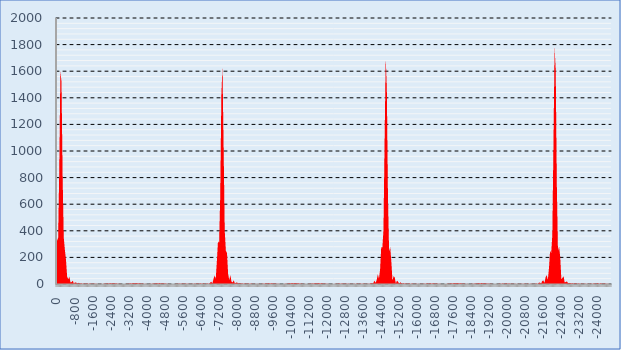
| Category | Series 0 |
|---|---|
| 0.0 | 324.139 |
| -50.0 | 347.293 |
| -100.0 | 855.829 |
| -150.0 | 1596.066 |
| -200.0 | 1522.161 |
| -250.0 | 809.824 |
| -300.0 | 350.562 |
| -350.0 | 256.687 |
| -400.0 | 180.606 |
| -450.0 | 55.817 |
| -500.0 | 36.286 |
| -550.0 | 54.382 |
| -600.0 | 11.873 |
| -650.0 | 14.307 |
| -700.0 | 25.778 |
| -750.0 | 1.802 |
| -800.0 | 12.129 |
| -850.0 | 11.323 |
| -900.0 | 0.626 |
| -950.0 | 9.683 |
| -1000.0 | 2.788 |
| -1050.0 | 2.96 |
| -1100.0 | 5.514 |
| -1150.0 | 0.254 |
| -1200.0 | 5.251 |
| -1250.0 | 1.764 |
| -1300.0 | 1.948 |
| -1350.0 | 5.346 |
| -1400.0 | 0.113 |
| -1450.0 | 4.185 |
| -1500.0 | 3.317 |
| -1550.0 | 0.353 |
| -1600.0 | 4.18 |
| -1650.0 | 0.961 |
| -1700.0 | 1.043 |
| -1750.0 | 2.065 |
| -1800.0 | 0.179 |
| -1850.0 | 1.098 |
| -1900.0 | 0.273 |
| -1950.0 | 1.487 |
| -2000.0 | 0.707 |
| -2050.0 | 0.991 |
| -2100.0 | 3.765 |
| -2150.0 | 0.818 |
| -2200.0 | 4.047 |
| -2250.0 | 5.254 |
| -2300.0 | 1.878 |
| -2350.0 | 7.042 |
| -2400.0 | 4.913 |
| -2450.0 | 3.163 |
| -2500.0 | 7.515 |
| -2550.0 | 3.068 |
| -2600.0 | 3.424 |
| -2650.0 | 5.14 |
| -2700.0 | 1.019 |
| -2750.0 | 2.218 |
| -2800.0 | 2.033 |
| -2850.0 | 0.037 |
| -2900.0 | 0.582 |
| -2950.0 | 0.924 |
| -3000.0 | 0.56 |
| -3050.0 | 0.274 |
| -3100.0 | 2.831 |
| -3150.0 | 2.06 |
| -3200.0 | 2.167 |
| -3250.0 | 6.222 |
| -3300.0 | 3.516 |
| -3350.0 | 5.265 |
| -3400.0 | 8.338 |
| -3450.0 | 4.064 |
| -3500.0 | 7.344 |
| -3550.0 | 7.481 |
| -3600.0 | 3.431 |
| -3650.0 | 6.783 |
| -3700.0 | 4.341 |
| -3750.0 | 2.003 |
| -3800.0 | 4.023 |
| -3850.0 | 1.309 |
| -3900.0 | 0.588 |
| -3950.0 | 1.332 |
| -4000.0 | 0.465 |
| -4050.0 | 0 |
| -4100.0 | 0.97 |
| -4150.0 | 1.973 |
| -4200.0 | 0.624 |
| -4250.0 | 3.295 |
| -4300.0 | 4.155 |
| -4350.0 | 2.153 |
| -4400.0 | 6.422 |
| -4450.0 | 5.033 |
| -4500.0 | 3.691 |
| -4550.0 | 7.774 |
| -4600.0 | 3.932 |
| -4650.0 | 4.257 |
| -4700.0 | 6.218 |
| -4750.0 | 1.839 |
| -4800.0 | 3.44 |
| -4850.0 | 2.98 |
| -4900.0 | 0.34 |
| -4950.0 | 1.744 |
| -5000.0 | 0.554 |
| -5050.0 | 0.218 |
| -5100.0 | 0.304 |
| -5150.0 | 0.579 |
| -5200.0 | 0.936 |
| -5250.0 | 0.109 |
| -5300.0 | 2.496 |
| -5350.0 | 1.377 |
| -5400.0 | 1.258 |
| -5450.0 | 4.169 |
| -5500.0 | 1.041 |
| -5550.0 | 2.869 |
| -5600.0 | 3.866 |
| -5650.0 | 0.534 |
| -5700.0 | 3.738 |
| -5750.0 | 1.858 |
| -5800.0 | 0.907 |
| -5850.0 | 3.26 |
| -5900.0 | 0.167 |
| -5950.0 | 2.472 |
| -6000.0 | 1.874 |
| -6050.0 | 0.658 |
| -6100.0 | 4.272 |
| -6150.0 | 0.639 |
| -6200.0 | 3.181 |
| -6250.0 | 4.829 |
| -6300.0 | 0.276 |
| -6350.0 | 5.544 |
| -6400.0 | 3.662 |
| -6450.0 | 0.524 |
| -6500.0 | 5.665 |
| -6550.0 | 2.391 |
| -6600.0 | 0.478 |
| -6650.0 | 4.549 |
| -6700.0 | 4.761 |
| -6750.0 | 0.067 |
| -6800.0 | 8.823 |
| -6850.0 | 17.345 |
| -6900.0 | 3.51 |
| -6950.0 | 37.293 |
| -7000.0 | 64.078 |
| -7050.0 | 38.153 |
| -7100.0 | 170.449 |
| -7150.0 | 321.155 |
| -7200.0 | 309.163 |
| -7250.0 | 663.767 |
| -7300.0 | 1421.388 |
| -7350.0 | 1639.619 |
| -7400.0 | 1035.175 |
| -7450.0 | 400.012 |
| -7500.0 | 251.017 |
| -7550.0 | 233.386 |
| -7600.0 | 77.409 |
| -7650.0 | 29.864 |
| -7700.0 | 66.458 |
| -7750.0 | 18.306 |
| -7800.0 | 11.367 |
| -7850.0 | 29.051 |
| -7900.0 | 3.63 |
| -7950.0 | 9.825 |
| -8000.0 | 11.979 |
| -8050.0 | 0.875 |
| -8100.0 | 8.104 |
| -8150.0 | 3.034 |
| -8200.0 | 2.795 |
| -8250.0 | 5.157 |
| -8300.0 | 0.343 |
| -8350.0 | 5.125 |
| -8400.0 | 2.215 |
| -8450.0 | 1.358 |
| -8500.0 | 5.317 |
| -8550.0 | 0.396 |
| -8600.0 | 2.818 |
| -8650.0 | 3.276 |
| -8700.0 | 0.043 |
| -8750.0 | 2.699 |
| -8800.0 | 0.906 |
| -8850.0 | 0.807 |
| -8900.0 | 1.236 |
| -8950.0 | 0.379 |
| -9000.0 | 2.029 |
| -9050.0 | 0.12 |
| -9100.0 | 2.353 |
| -9150.0 | 3.058 |
| -9200.0 | 0.673 |
| -9250.0 | 5.463 |
| -9300.0 | 3.425 |
| -9350.0 | 2.598 |
| -9400.0 | 7.406 |
| -9450.0 | 2.949 |
| -9500.0 | 4.27 |
| -9550.0 | 6.743 |
| -9600.0 | 1.821 |
| -9650.0 | 4.225 |
| -9700.0 | 4.026 |
| -9750.0 | 0.604 |
| -9800.0 | 2.488 |
| -9850.0 | 1.387 |
| -9900.0 | 0.011 |
| -9950.0 | 0.616 |
| -10000.0 | 0.911 |
| -10050.0 | 0.486 |
| -10100.0 | 0.426 |
| -10150.0 | 3.056 |
| -10200.0 | 1.854 |
| -10250.0 | 2.45 |
| -10300.0 | 6.297 |
| -10350.0 | 3.329 |
| -10400.0 | 5.431 |
| -10450.0 | 8.272 |
| -10500.0 | 3.975 |
| -10550.0 | 7.252 |
| -10600.0 | 7.54 |
| -10650.0 | 3.345 |
| -10700.0 | 6.585 |
| -10750.0 | 4.639 |
| -10800.0 | 1.827 |
| -10850.0 | 3.949 |
| -10900.0 | 1.654 |
| -10950.0 | 0.415 |
| -11000.0 | 1.335 |
| -11050.0 | 0.654 |
| -11100.0 | 0.028 |
| -11150.0 | 0.704 |
| -11200.0 | 2.174 |
| -11250.0 | 0.863 |
| -11300.0 | 2.521 |
| -11350.0 | 4.883 |
| -11400.0 | 2.279 |
| -11450.0 | 5.427 |
| -11500.0 | 6.635 |
| -11550.0 | 3.277 |
| -11600.0 | 7.287 |
| -11650.0 | 6.086 |
| -11700.0 | 3.219 |
| -11750.0 | 6.762 |
| -11800.0 | 3.644 |
| -11850.0 | 2.231 |
| -11900.0 | 4.249 |
| -11950.0 | 1.071 |
| -12000.0 | 1.023 |
| -12050.0 | 1.493 |
| -12100.0 | 0.082 |
| -12150.0 | 0.298 |
| -12200.0 | 0.268 |
| -12250.0 | 1.064 |
| -12300.0 | 0.269 |
| -12350.0 | 1.119 |
| -12400.0 | 2.866 |
| -12450.0 | 0.64 |
| -12500.0 | 3.103 |
| -12550.0 | 3.809 |
| -12600.0 | 1.012 |
| -12650.0 | 4.61 |
| -12700.0 | 3.062 |
| -12750.0 | 1.288 |
| -12800.0 | 4.572 |
| -12850.0 | 1.299 |
| -12900.0 | 1.699 |
| -12950.0 | 3.132 |
| -13000.0 | 0.11 |
| -13050.0 | 2.409 |
| -13100.0 | 1.347 |
| -13150.0 | 0.637 |
| -13200.0 | 3.135 |
| -13250.0 | 0.263 |
| -13300.0 | 2.551 |
| -13350.0 | 3.232 |
| -13400.0 | 0.161 |
| -13450.0 | 4.239 |
| -13500.0 | 2.353 |
| -13550.0 | 0.534 |
| -13600.0 | 4.162 |
| -13650.0 | 1.249 |
| -13700.0 | 0.754 |
| -13750.0 | 2.487 |
| -13800.0 | 2.107 |
| -13850.0 | 0.883 |
| -13900.0 | 1.911 |
| -13950.0 | 8.372 |
| -14000.0 | 2.231 |
| -14050.0 | 7.736 |
| -14100.0 | 25.732 |
| -14150.0 | 8.767 |
| -14200.0 | 30.531 |
| -14250.0 | 73.992 |
| -14300.0 | 40.433 |
| -14350.0 | 109.29 |
| -14400.0 | 276.639 |
| -14450.0 | 274.151 |
| -14500.0 | 405.15 |
| -14550.0 | 1074.11 |
| -14600.0 | 1705.976 |
| -14650.0 | 1462.725 |
| -14700.0 | 651.9 |
| -14750.0 | 247.337 |
| -14800.0 | 278.326 |
| -14850.0 | 168.052 |
| -14900.0 | 24.975 |
| -14950.0 | 59.717 |
| -15000.0 | 49.039 |
| -15050.0 | 3.965 |
| -15100.0 | 24.828 |
| -15150.0 | 16.195 |
| -15200.0 | 2.556 |
| -15250.0 | 12.522 |
| -15300.0 | 4.397 |
| -15350.0 | 4.124 |
| -15400.0 | 5.722 |
| -15450.0 | 1.346 |
| -15500.0 | 5.52 |
| -15550.0 | 1.99 |
| -15600.0 | 2.067 |
| -15650.0 | 5.411 |
| -15700.0 | 0.354 |
| -15750.0 | 3.258 |
| -15800.0 | 3.687 |
| -15850.0 | 0.069 |
| -15900.0 | 3.262 |
| -15950.0 | 1.425 |
| -16000.0 | 0.719 |
| -16050.0 | 2.155 |
| -16100.0 | 0.177 |
| -16150.0 | 2.103 |
| -16200.0 | 0.99 |
| -16250.0 | 0.887 |
| -16300.0 | 3.858 |
| -16350.0 | 0.655 |
| -16400.0 | 3.169 |
| -16450.0 | 5.253 |
| -16500.0 | 1.143 |
| -16550.0 | 5.519 |
| -16600.0 | 5.47 |
| -16650.0 | 1.702 |
| -16700.0 | 6.334 |
| -16750.0 | 4.217 |
| -16800.0 | 1.604 |
| -16850.0 | 5.055 |
| -16900.0 | 2.149 |
| -16950.0 | 0.84 |
| -17000.0 | 2.578 |
| -17050.0 | 0.634 |
| -17100.0 | 0.148 |
| -17150.0 | 0.64 |
| -17200.0 | 0.904 |
| -17250.0 | 0.368 |
| -17300.0 | 0.602 |
| -17350.0 | 3.15 |
| -17400.0 | 1.665 |
| -17450.0 | 2.492 |
| -17500.0 | 6.24 |
| -17550.0 | 3.294 |
| -17600.0 | 4.993 |
| -17650.0 | 8.362 |
| -17700.0 | 4.11 |
| -17750.0 | 6.376 |
| -17800.0 | 8.203 |
| -17850.0 | 3.467 |
| -17900.0 | 5.704 |
| -17950.0 | 5.861 |
| -18000.0 | 1.784 |
| -18050.0 | 3.447 |
| -18100.0 | 2.838 |
| -18150.0 | 0.316 |
| -18200.0 | 1.101 |
| -18250.0 | 1.075 |
| -18300.0 | 0.266 |
| -18350.0 | 0.108 |
| -18400.0 | 1.678 |
| -18450.0 | 1.88 |
| -18500.0 | 0.879 |
| -18550.0 | 4.199 |
| -18600.0 | 4.208 |
| -18650.0 | 2.593 |
| -18700.0 | 6.962 |
| -18750.0 | 5.738 |
| -18800.0 | 3.867 |
| -18850.0 | 8.179 |
| -18900.0 | 5.45 |
| -18950.0 | 3.776 |
| -19000.0 | 7.1 |
| -19050.0 | 3.544 |
| -19100.0 | 2.46 |
| -19150.0 | 4.413 |
| -19200.0 | 1.309 |
| -19250.0 | 0.911 |
| -19300.0 | 1.683 |
| -19350.0 | 0.233 |
| -19400.0 | 0.166 |
| -19450.0 | 0.281 |
| -19500.0 | 0.989 |
| -19550.0 | 0.536 |
| -19600.0 | 0.561 |
| -19650.0 | 3.008 |
| -19700.0 | 1.444 |
| -19750.0 | 1.817 |
| -19800.0 | 4.92 |
| -19850.0 | 1.966 |
| -19900.0 | 2.952 |
| -19950.0 | 5.508 |
| -20000.0 | 1.613 |
| -20050.0 | 3.29 |
| -20100.0 | 4.486 |
| -20150.0 | 0.726 |
| -20200.0 | 2.934 |
| -20250.0 | 2.576 |
| -20300.0 | 0.185 |
| -20350.0 | 2.46 |
| -20400.0 | 0.882 |
| -20450.0 | 0.656 |
| -20500.0 | 2.279 |
| -20550.0 | 0.087 |
| -20600.0 | 1.993 |
| -20650.0 | 2.252 |
| -20700.0 | 0.095 |
| -20750.0 | 3.268 |
| -20800.0 | 1.917 |
| -20850.0 | 0.363 |
| -20900.0 | 3.464 |
| -20950.0 | 1.159 |
| -21000.0 | 0.635 |
| -21050.0 | 2.31 |
| -21100.0 | 0.809 |
| -21150.0 | 1.501 |
| -21200.0 | 0.648 |
| -21250.0 | 2.67 |
| -21300.0 | 4.396 |
| -21350.0 | 0.043 |
| -21400.0 | 9.017 |
| -21450.0 | 11.368 |
| -21500.0 | 2.036 |
| -21550.0 | 22.493 |
| -21600.0 | 26.38 |
| -21650.0 | 8.523 |
| -21700.0 | 49.336 |
| -21750.0 | 66.814 |
| -21800.0 | 31.732 |
| -21850.0 | 118.089 |
| -21900.0 | 249.028 |
| -21950.0 | 231.854 |
| -22000.0 | 372.108 |
| -22050.0 | 1054.213 |
| -22100.0 | 1778.842 |
| -22150.0 | 1614.727 |
| -22200.0 | 745.466 |
| -22250.0 | 249.955 |
| -22300.0 | 280.596 |
| -22350.0 | 205.056 |
| -22400.0 | 37.943 |
| -22450.0 | 46.311 |
| -22500.0 | 58.203 |
| -22550.0 | 10.736 |
| -22600.0 | 15.197 |
| -22650.0 | 19.762 |
| -22700.0 | 4.852 |
| -22750.0 | 8.115 |
| -22800.0 | 6.324 |
| -22850.0 | 4.067 |
| -22900.0 | 5.899 |
| -22950.0 | 1.582 |
| -23000.0 | 4.719 |
| -23050.0 | 4.803 |
| -23100.0 | 0.338 |
| -23150.0 | 5.047 |
| -23200.0 | 3.499 |
| -23250.0 | 0.308 |
| -23300.0 | 4.429 |
| -23350.0 | 1.848 |
| -23400.0 | 0.744 |
| -23450.0 | 3.249 |
| -23500.0 | 0.464 |
| -23550.0 | 1.726 |
| -23600.0 | 2.328 |
| -23650.0 | 0.038 |
| -23700.0 | 3.374 |
| -23750.0 | 2.182 |
| -23800.0 | 0.685 |
| -23850.0 | 5.302 |
| -23900.0 | 2.617 |
| -23950.0 | 1.781 |
| -24000.0 | 6.634 |
| -24050.0 | 2.925 |
| -24100.0 | 2.402 |
| -24150.0 | 6.55 |
| -24200.0 | 2.513 |
| -24250.0 | 2.023 |
| -24300.0 | 4.921 |
| -24350.0 | 1.465 |
| -24400.0 | 0.956 |
| -24450.0 | 2.52 |
| -24500.0 | 0.571 |
| -24550.0 | 0.171 |
| -24600.0 | 0.605 |
| -24650.0 | 0.792 |